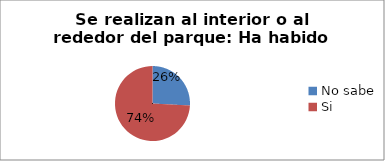
| Category | Series 0 |
|---|---|
| No sabe | 0.259 |
| Si | 0.741 |